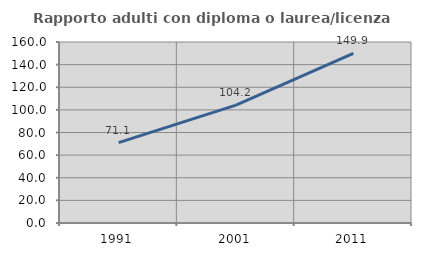
| Category | Rapporto adulti con diploma o laurea/licenza media  |
|---|---|
| 1991.0 | 71.111 |
| 2001.0 | 104.167 |
| 2011.0 | 149.856 |